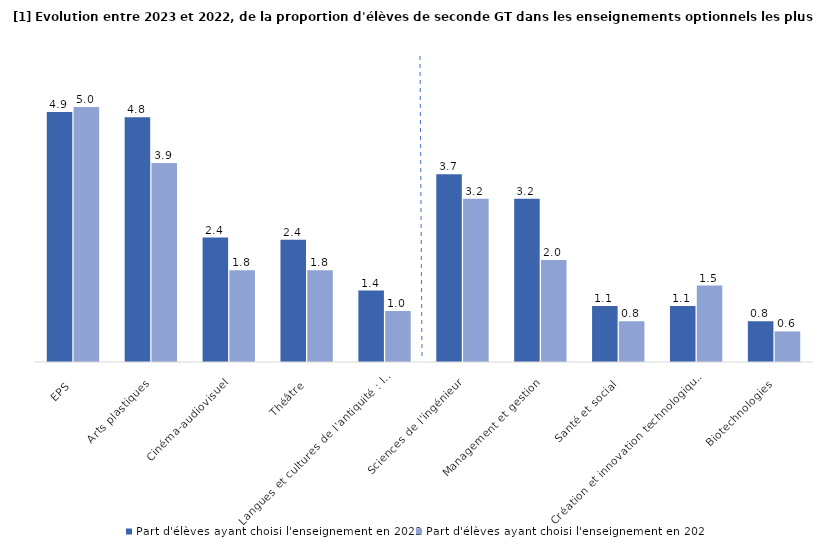
| Category | Part d'élèves ayant choisi l'enseignement en 2022 | Part d'élèves ayant choisi l'enseignement en 2023 |
|---|---|---|
| EPS | 4.9 | 5 |
| Arts plastiques | 4.8 | 3.9 |
| Cinéma-audiovisuel | 2.439 | 1.8 |
| Théâtre | 2.395 | 1.8 |
| Langues et cultures de l'antiquité : latin | 1.4 | 1 |
| Sciences de l'ingénieur | 3.681 | 3.2 |
| Management et gestion | 3.2 | 2 |
| Santé et social | 1.1 | 0.8 |
| Création et innovation technologiques | 1.1 | 1.5 |
| Biotechnologies | 0.8 | 0.6 |